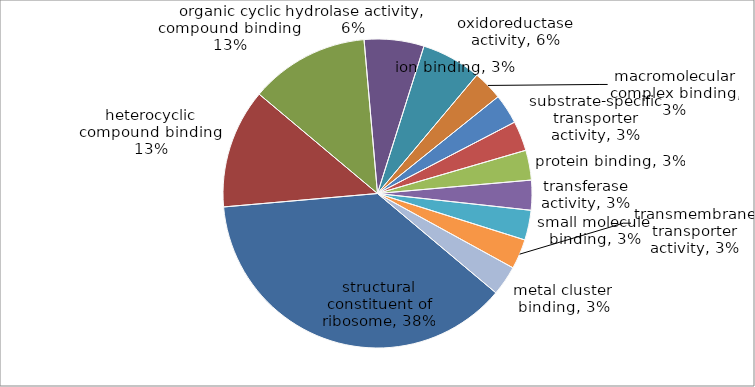
| Category | Series 0 |
|---|---|
| structural constituent of ribosome | 12 |
| heterocyclic compound binding | 4 |
| organic cyclic compound binding | 4 |
| hydrolase activity | 2 |
| oxidoreductase activity | 2 |
| macromolecular complex binding | 1 |
| ion binding | 1 |
| substrate-specific transporter activity | 1 |
| protein binding | 1 |
| transferase activity | 1 |
| small molecule binding | 1 |
| transmembrane transporter activity | 1 |
| metal cluster binding | 1 |